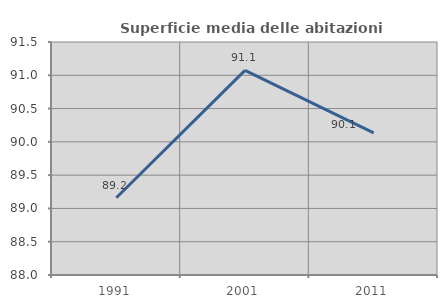
| Category | Superficie media delle abitazioni occupate |
|---|---|
| 1991.0 | 89.161 |
| 2001.0 | 91.074 |
| 2011.0 | 90.134 |